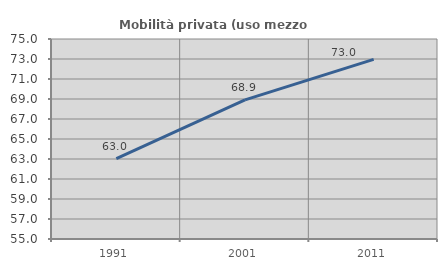
| Category | Mobilità privata (uso mezzo privato) |
|---|---|
| 1991.0 | 63.041 |
| 2001.0 | 68.914 |
| 2011.0 | 72.96 |